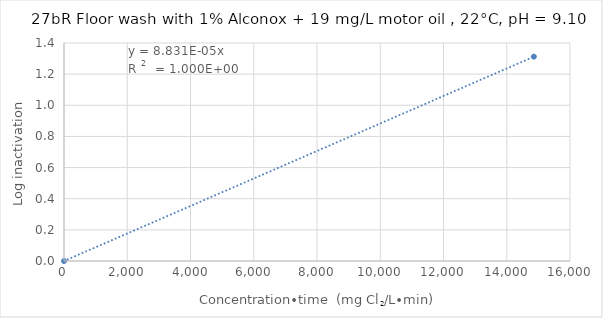
| Category | Series 0 |
|---|---|
| 0.0 | 0 |
| 14857.428714357178 | 1.312 |